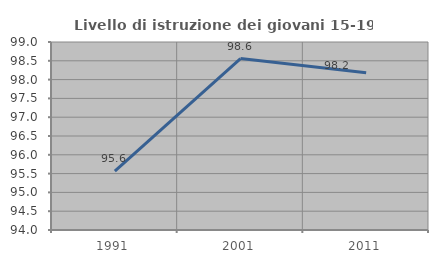
| Category | Livello di istruzione dei giovani 15-19 anni |
|---|---|
| 1991.0 | 95.564 |
| 2001.0 | 98.559 |
| 2011.0 | 98.182 |